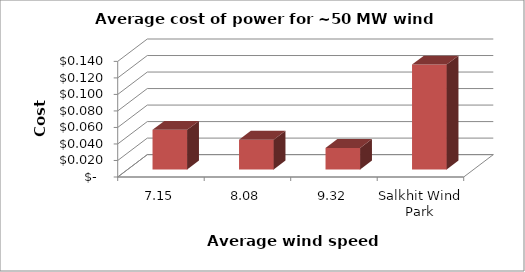
| Category | Cost/kWh |
|---|---|
| 7.15  | 0.048 |
| 8.08  | 0.036 |
| 9.32  | 0.026 |
| Salkhit Wind Park | 0.127 |